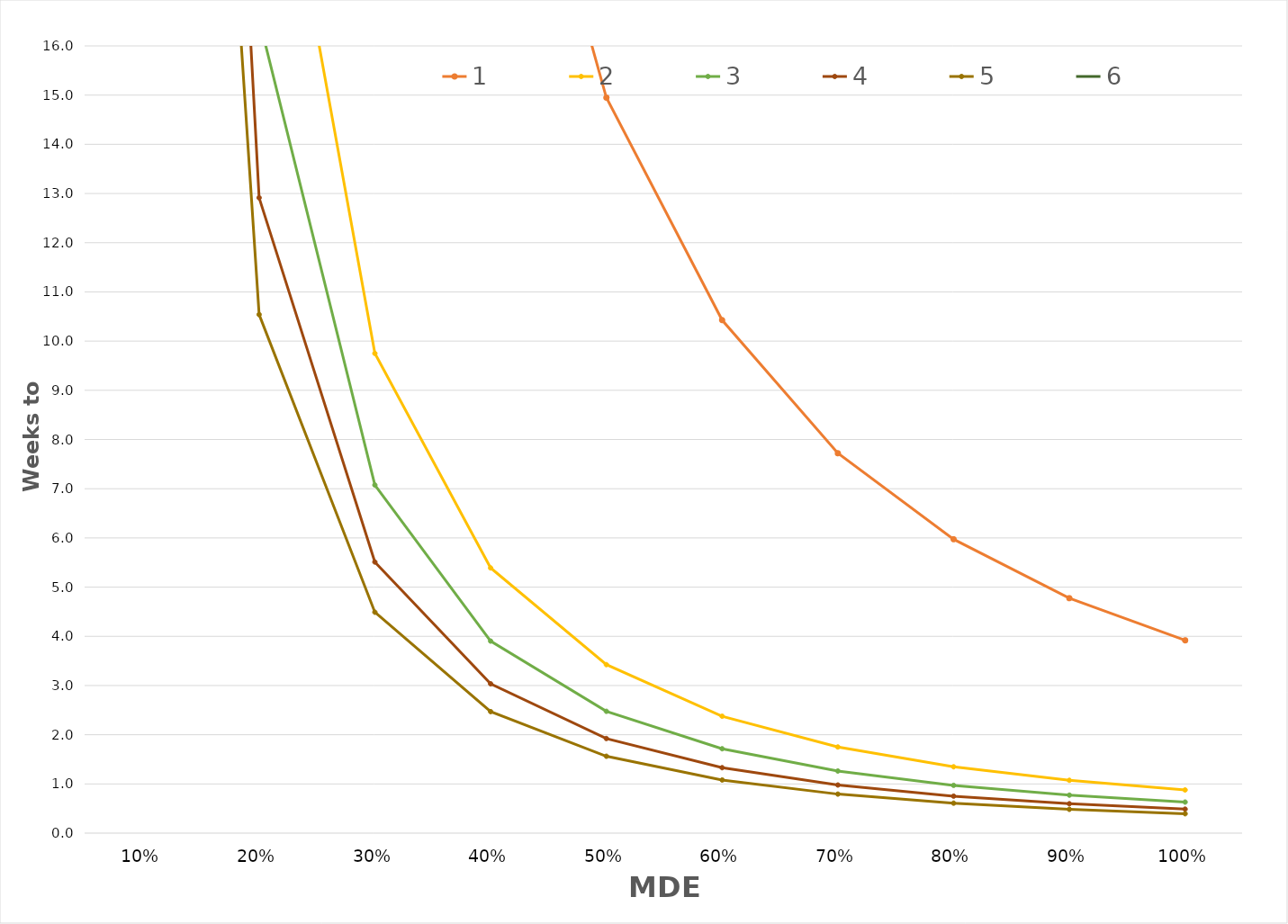
| Category | 1 | 2 | 3 | 4 | 5 | 6 |
|---|---|---|---|---|---|---|
| 0.1 | 414.646 | 98.645 | 72.002 | 56.359 | 46.113 |  |
| 0.2 | 96.968 | 22.747 | 16.544 | 12.913 | 10.539 |  |
| 0.3 | 41.969 | 9.75 | 7.074 | 5.51 | 4.49 |  |
| 0.4 | 23.377 | 5.39 | 3.903 | 3.035 | 2.469 |  |
| 0.5 | 14.947 | 3.424 | 2.476 | 1.923 | 1.562 |  |
| 0.6 | 10.427 | 2.376 | 1.715 | 1.33 | 1.08 |  |
| 0.7 | 7.721 | 1.751 | 1.262 | 0.978 | 0.793 |  |
| 0.8 | 5.973 | 1.348 | 0.971 | 0.752 | 0.609 |  |
| 0.9 | 4.775 | 1.074 | 0.772 | 0.597 | 0.484 |  |
| 1.0 | 3.919 | 0.878 | 0.631 | 0.488 | 0.395 |  |